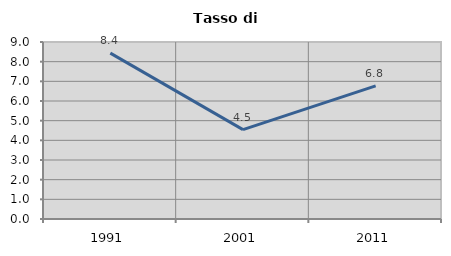
| Category | Tasso di disoccupazione   |
|---|---|
| 1991.0 | 8.435 |
| 2001.0 | 4.545 |
| 2011.0 | 6.772 |